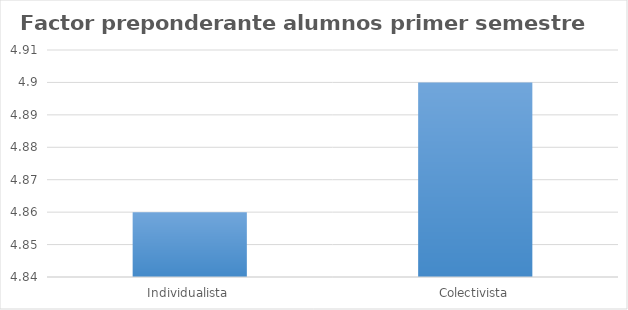
| Category | Series 0 |
|---|---|
| Individualista | 4.86 |
| Colectivista | 4.9 |